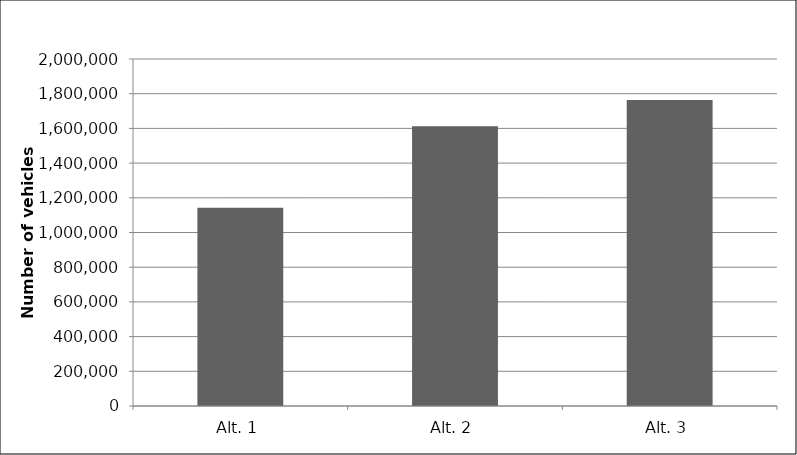
| Category | Number of Vehicles Removed from Fleet Corresponding to Emissions Reductions from Baseline Alternative |
|---|---|
| Alt. 1 | 1143016.767 |
| Alt. 2 | 1613006.914 |
| Alt. 3 | 1763066.278 |